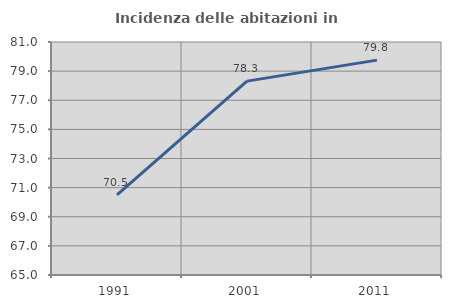
| Category | Incidenza delle abitazioni in proprietà  |
|---|---|
| 1991.0 | 70.508 |
| 2001.0 | 78.314 |
| 2011.0 | 79.755 |